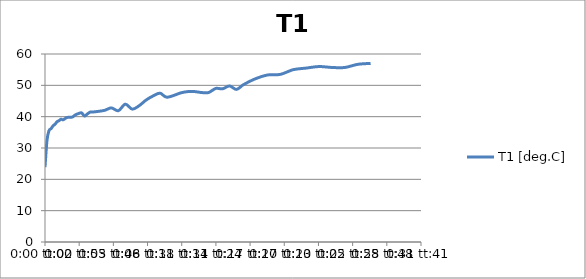
| Category | T1 |
|---|---|
| 0.0 | 23.9 |
| 0.00011574074074077734 | 32.4 |
| 0.00023148148148149916 | 35.5 |
| 0.0003587962962963154 | 36.2 |
| 0.0004745370370370927 | 37.1 |
| 0.0005902777777778145 | 37.6 |
| 0.0007060185185185364 | 38.4 |
| 0.0008217592592592582 | 38.7 |
| 0.0009375000000000355 | 39.2 |
| 0.0010648148148148517 | 39 |
| 0.0012615740740740677 | 39.7 |
| 0.001435185185185206 | 39.8 |
| 0.0016087962962963442 | 39.9 |
| 0.0017824074074074825 | 40.6 |
| 0.001967592592592604 | 41 |
| 0.002141203703703687 | 41.2 |
| 0.0023148148148148806 | 40.2 |
| 0.0024884259259259633 | 40.9 |
| 0.0026620370370371016 | 41.5 |
| 0.0028356481481481843 | 41.5 |
| 0.0034722222222222654 | 42 |
| 0.0038773148148148473 | 42.8 |
| 0.004293981481481524 | 41.9 |
| 0.004699074074074161 | 44 |
| 0.005104166666666687 | 42.4 |
| 0.005509259259259325 | 43.5 |
| 0.005914351851851851 | 45.3 |
| 0.006319444444444489 | 46.6 |
| 0.006736111111111109 | 47.5 |
| 0.007141203703703747 | 46.2 |
| 0.00795138888888891 | 47.6 |
| 0.008356481481481548 | 48 |
| 0.008761574074074074 | 48 |
| 0.009166666666666712 | 47.7 |
| 0.009571759259259294 | 47.7 |
| 0.00998842592592597 | 49 |
| 0.010393518518518607 | 48.9 |
| 0.010798611111111134 | 49.8 |
| 0.011203703703703771 | 48.7 |
| 0.011608796296296298 | 50.2 |
| 0.012268518518518567 | 52 |
| 0.013020833333333315 | 53.3 |
| 0.013773148148148173 | 53.5 |
| 0.014525462962962976 | 55 |
| 0.015277777777777779 | 55.5 |
| 0.016030092592592637 | 56 |
| 0.016793981481481535 | 55.7 |
| 0.017546296296296282 | 55.7 |
| 0.01829861111111114 | 56.7 |
| 0.019050925925925943 | 57 |